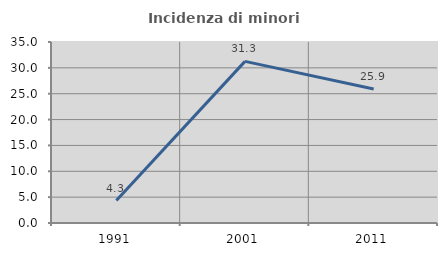
| Category | Incidenza di minori stranieri |
|---|---|
| 1991.0 | 4.348 |
| 2001.0 | 31.25 |
| 2011.0 | 25.907 |